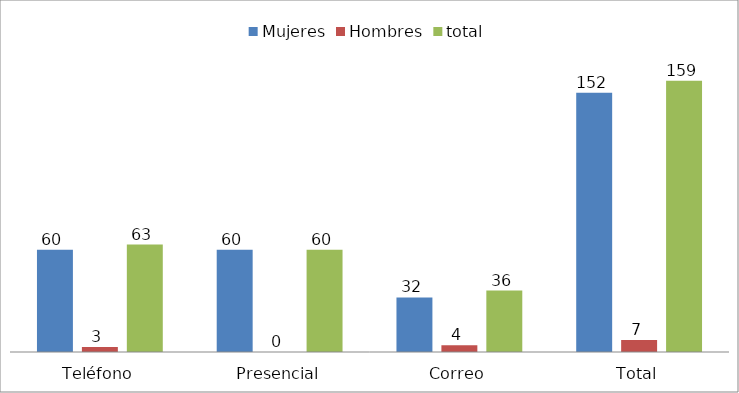
| Category | Mujeres | Hombres | total |
|---|---|---|---|
| Teléfono | 60 | 3 | 63 |
| Presencial | 60 | 0 | 60 |
| Correo | 32 | 4 | 36 |
| Total | 152 | 7 | 159 |